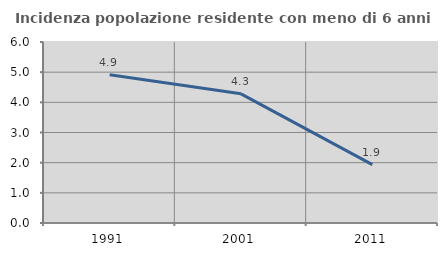
| Category | Incidenza popolazione residente con meno di 6 anni |
|---|---|
| 1991.0 | 4.912 |
| 2001.0 | 4.282 |
| 2011.0 | 1.935 |